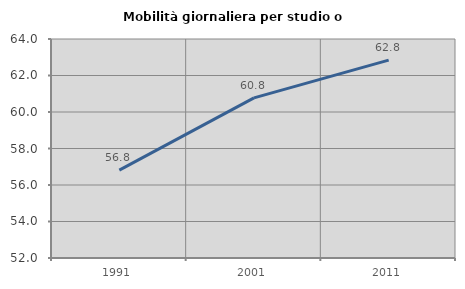
| Category | Mobilità giornaliera per studio o lavoro |
|---|---|
| 1991.0 | 56.819 |
| 2001.0 | 60.775 |
| 2011.0 | 62.842 |